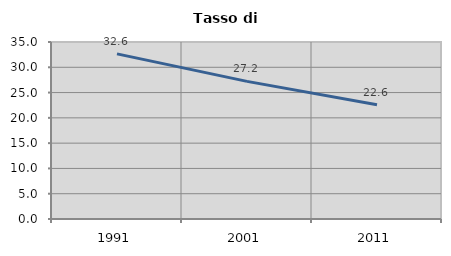
| Category | Tasso di disoccupazione   |
|---|---|
| 1991.0 | 32.649 |
| 2001.0 | 27.214 |
| 2011.0 | 22.591 |